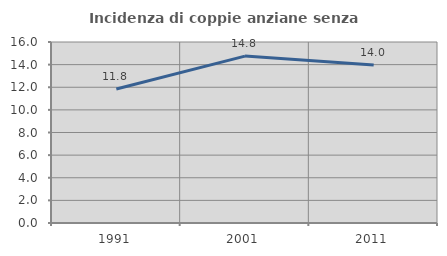
| Category | Incidenza di coppie anziane senza figli  |
|---|---|
| 1991.0 | 11.85 |
| 2001.0 | 14.755 |
| 2011.0 | 13.964 |